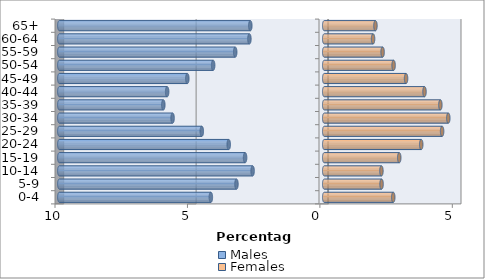
| Category | Males | Females |
|---|---|---|
| 0-4 | -4.28 | 2.606 |
| 5-9 | -3.313 | 2.165 |
| 10-14 | -2.704 | 2.16 |
| 15-19 | -2.987 | 2.832 |
| 20-24 | -3.605 | 3.663 |
| 25-29 | -4.622 | 4.451 |
| 30-34 | -5.725 | 4.685 |
| 35-39 | -6.074 | 4.385 |
| 40-44 | -5.93 | 3.786 |
| 45-49 | -5.168 | 3.09 |
| 50-54 | -4.193 | 2.619 |
| 55-59 | -3.36 | 2.204 |
| 60-64 | -2.824 | 1.844 |
| 65+ | -2.79 | 1.934 |